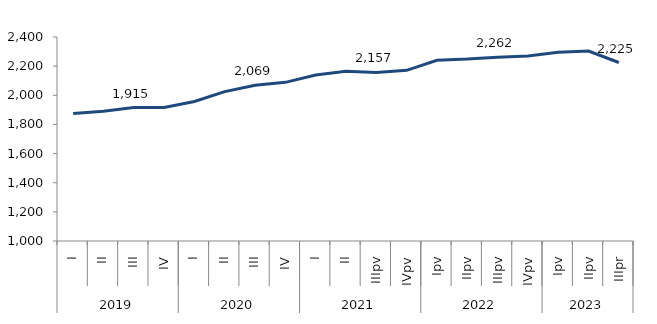
| Category | Series 0 |
|---|---|
| 0 | 1874.506 |
| 1900-01-01 | 1890.765 |
| 1900-01-02 | 1915.409 |
| 1900-01-03 | 1916.91 |
| 1900-01-04 | 1957.333 |
| 1900-01-05 | 2025.14 |
| 1900-01-06 | 2069.115 |
| 1900-01-07 | 2088.68 |
| 1900-01-08 | 2139.304 |
| 1900-01-09 | 2165.658 |
| 1900-01-10 | 2157.112 |
| 1900-01-11 | 2171.274 |
| 1900-01-12 | 2240.466 |
| 1900-01-13 | 2248.726 |
| 1900-01-14 | 2261.745 |
| 1900-01-15 | 2269.613 |
| 1900-01-16 | 2294.569 |
| 1900-01-17 | 2304 |
| 1900-01-18 | 2225 |